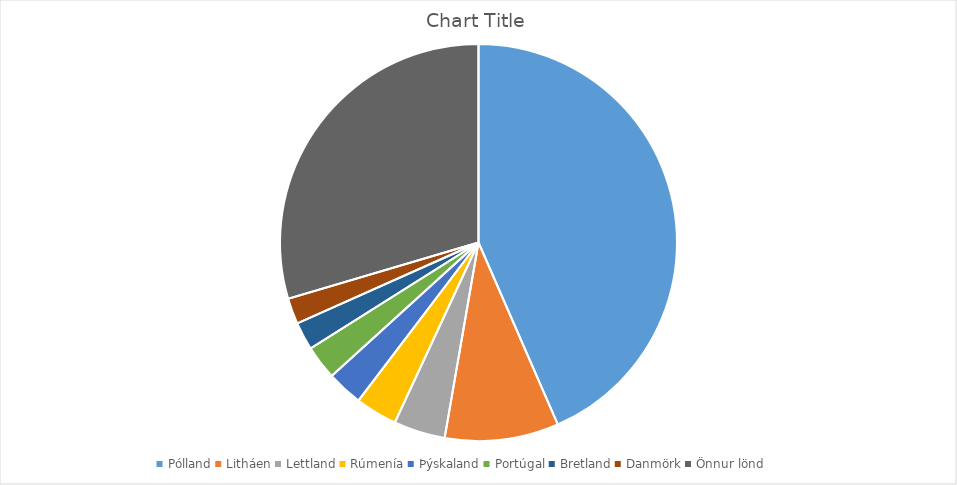
| Category | Series 0 |
|---|---|
| Pólland | 0.435 |
| Litháen | 0.093 |
| Lettland | 0.042 |
| Rúmenía | 0.034 |
| Þýskaland | 0.029 |
| Portúgal | 0.028 |
| Bretland | 0.023 |
| Danmörk | 0.021 |
| Önnur lönd | 0.296 |